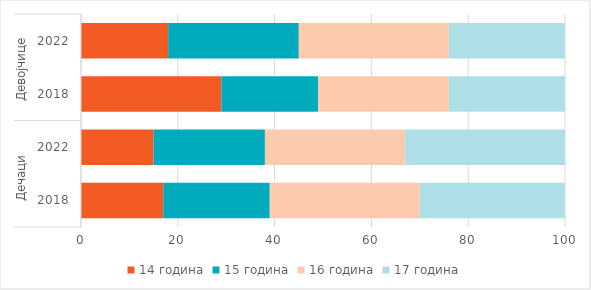
| Category | 14 година | 15 година | 16 година | 17 година |
|---|---|---|---|---|
| 0 | 17 | 22 | 31 | 30 |
| 1 | 15 | 23 | 29 | 33 |
| 2 | 29 | 20 | 27 | 25 |
| 3 | 18 | 27 | 31 | 24 |